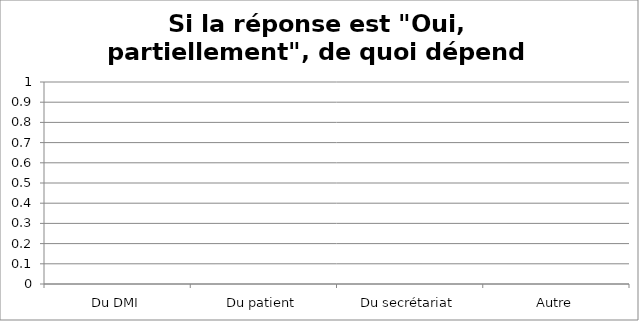
| Category | Si la réponse est "Oui, partiellement", de quoi dépend-elle ? Choix multiple |
|---|---|
| Du DMI | 0 |
| Du patient | 0 |
| Du secrétariat | 0 |
| Autre | 0 |